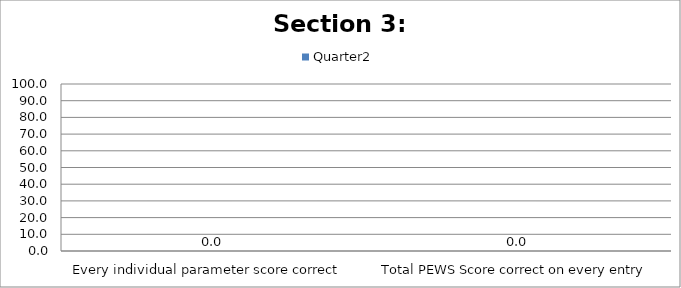
| Category | Quarter2 |
|---|---|
| Every individual parameter score correct  | 0 |
| Total PEWS Score correct on every entry | 0 |